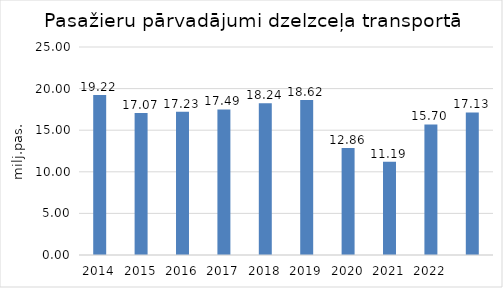
| Category | Series 0 | 2023 |
|---|---|---|
| 2014.0 | 19.222 |  |
| 2015.0 | 17.07 |  |
| 2016.0 | 17.228 |  |
| 2017.0 | 17.493 |  |
| 2018.0 | 18.241 |  |
| 2019.0 | 18.624 |  |
| 2020.0 | 12.862 |  |
| 2021.0 | 11.193 |  |
| 2022.0 | 15.695 |  |